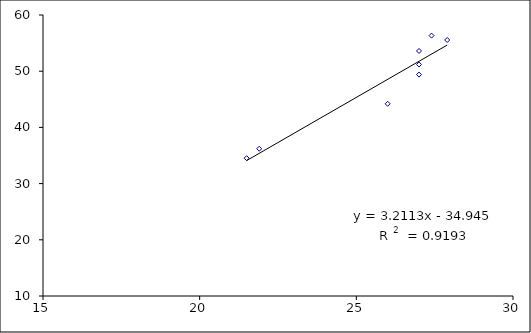
| Category | Series 0 |
|---|---|
| 21.5 | 34.52 |
| 27.0 | 49.4 |
| 27.0 | 53.6 |
| 27.0 | 51.2 |
| 21.9 | 36.2 |
| 26.0 | 44.2 |
| 27.4 | 56.338 |
| 27.9 | 55.556 |